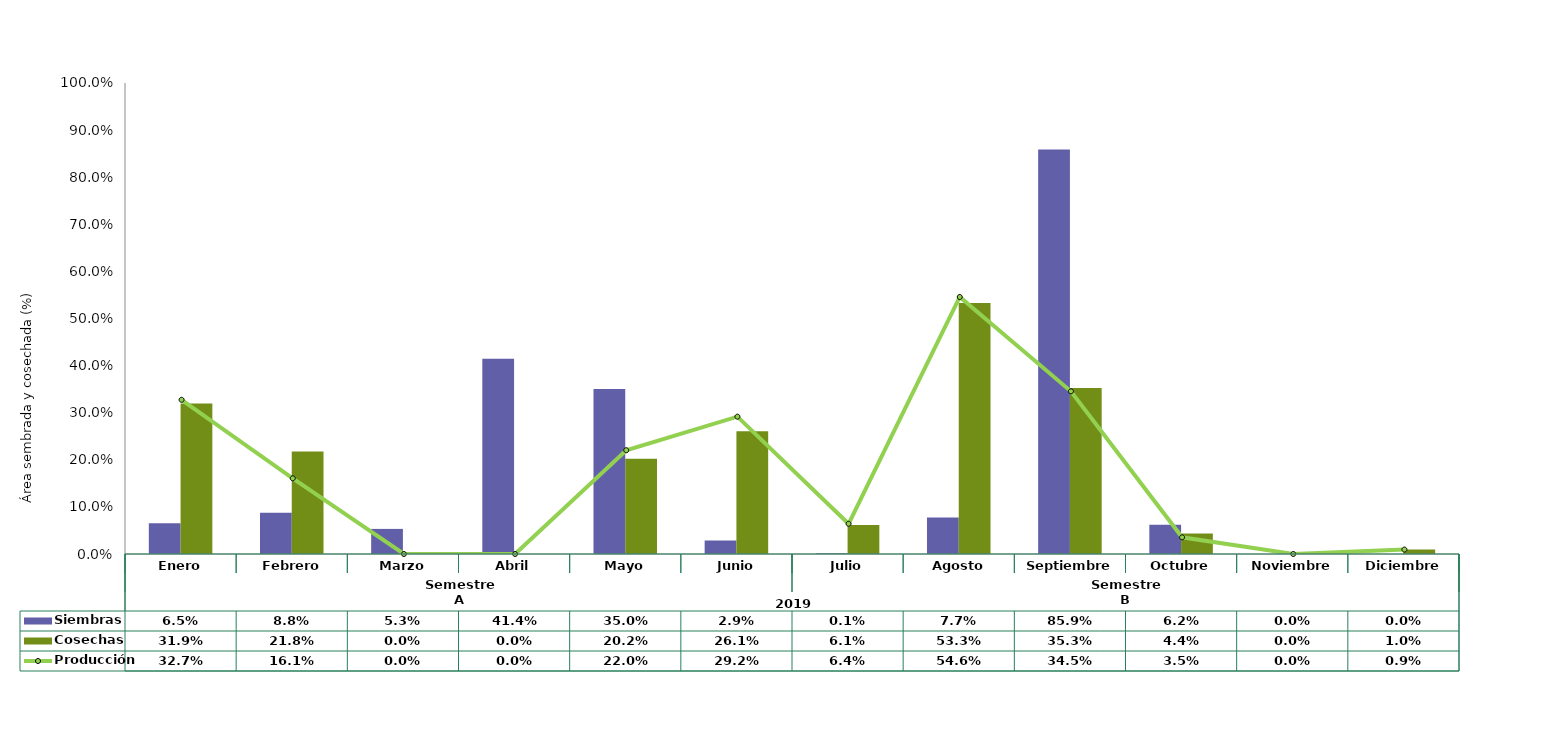
| Category | Siembras | Cosechas   |
|---|---|---|
| 0 | 0.065 | 0.319 |
| 1 | 0.088 | 0.218 |
| 2 | 0.053 | 0 |
| 3 | 0.414 | 0 |
| 4 | 0.35 | 0.202 |
| 5 | 0.029 | 0.261 |
| 6 | 0.001 | 0.061 |
| 7 | 0.077 | 0.533 |
| 8 | 0.859 | 0.353 |
| 9 | 0.062 | 0.044 |
| 10 | 0 | 0 |
| 11 | 0 | 0.01 |